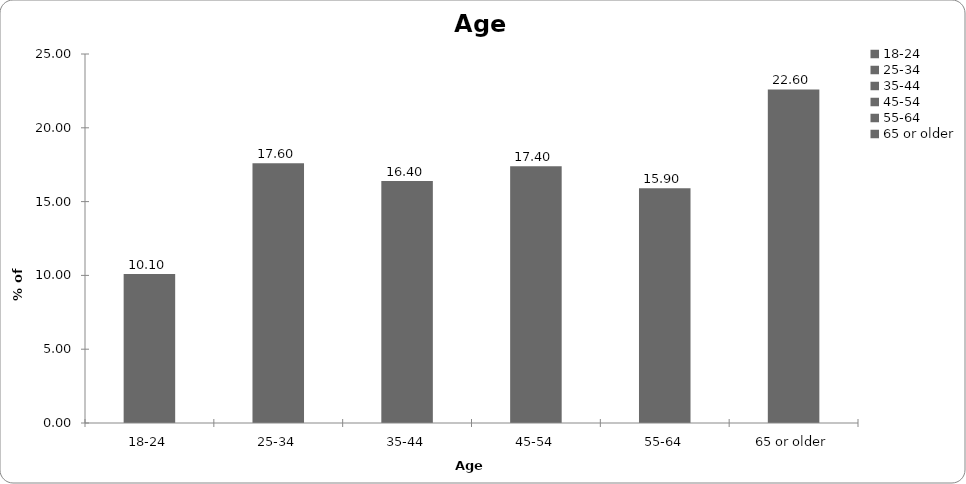
| Category | Age |
|---|---|
| 18-24 | 10.1 |
| 25-34 | 17.6 |
| 35-44 | 16.4 |
| 45-54 | 17.4 |
| 55-64 | 15.9 |
| 65 or older | 22.6 |